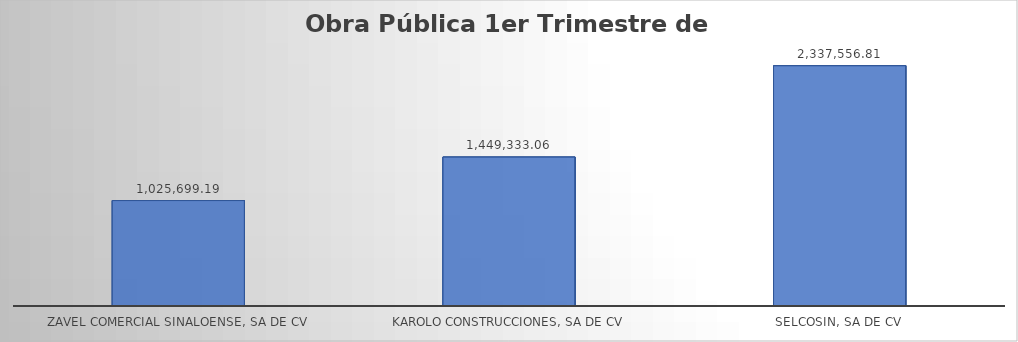
| Category | Suma  |
|---|---|
| ZAVEL COMERCIAL SINALOENSE, SA DE CV | 1025699.19 |
| KAROLO CONSTRUCCIONES, SA DE CV | 1449333.06 |
| SELCOSIN, SA DE CV | 2337556.81 |